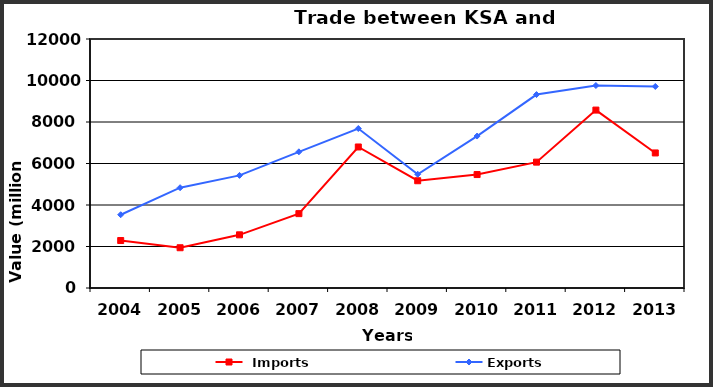
| Category |  Imports | Exports |
|---|---|---|
| 2004.0 | 2288 | 3531 |
| 2005.0 | 1940 | 4834 |
| 2006.0 | 2563 | 5426 |
| 2007.0 | 3584 | 6563 |
| 2008.0 | 6796 | 7686 |
| 2009.0 | 5169 | 5482 |
| 2010.0 | 5467 | 7323 |
| 2011.0 | 6066 | 9322 |
| 2012.0 | 8574 | 9758 |
| 2013.0 | 6509 | 9713 |